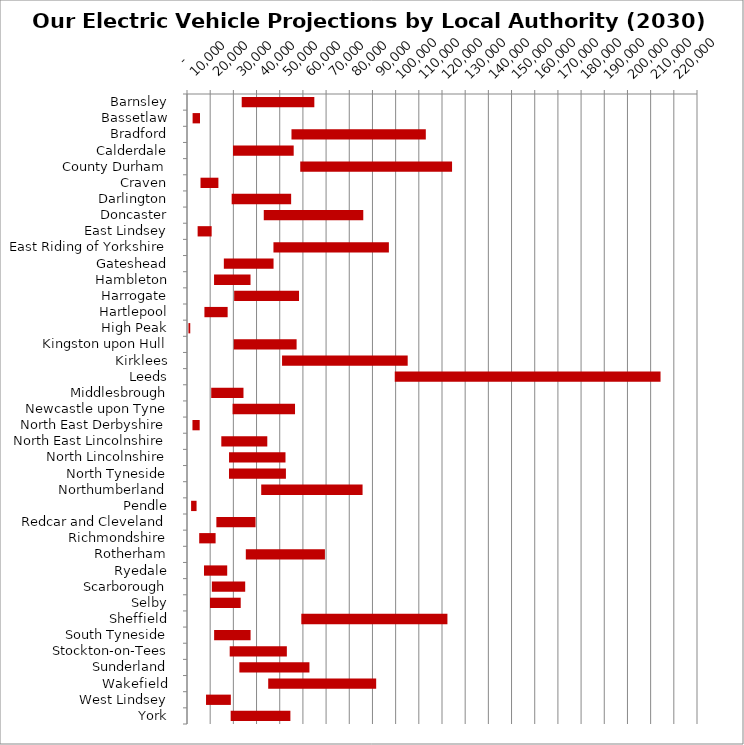
| Category | MIN | MAX |
|---|---|---|
| Barnsley | 23601 | 31328 |
| Bassetlaw | 2416 | 3187 |
| Bradford | 45069 | 57947 |
| Calderdale | 19852 | 26172 |
| County Durham | 48853 | 65486 |
| Craven | 5831 | 7712 |
| Darlington | 19267 | 25658 |
| Doncaster | 33117 | 42925 |
| East Lindsey | 4584 | 6050 |
| East Riding of Yorkshire | 37291 | 49794 |
| Gateshead | 15894 | 21439 |
| Hambleton | 11671 | 15729 |
| Harrogate | 20339 | 27982 |
| Hartlepool | 7515 | 10016 |
| High Peak | 624 | 779 |
| Kingston upon Hull | 20161 | 27120 |
| Kirklees | 41003 | 54198 |
| Leeds | 89622 | 114645 |
| Middlesbrough | 10445 | 13919 |
| Newcastle upon Tyne | 19670 | 26930 |
| North East Derbyshire | 2353 | 3116 |
| North East Lincolnshire | 14801 | 19834 |
| North Lincolnshire | 18135 | 24351 |
| North Tyneside | 18117 | 24555 |
| Northumberland | 32016 | 43718 |
| Pendle | 1768 | 2355 |
| Redcar and Cleveland | 12671 | 16897 |
| Richmondshire | 5266 | 7071 |
| Rotherham | 25372 | 34125 |
| Ryedale | 7345 | 9998 |
| Scarborough | 10725 | 14379 |
| Selby | 9910 | 13260 |
| Sheffield | 49314 | 63024 |
| South Tyneside | 11703 | 15721 |
| Stockton-on-Tees | 18419 | 24655 |
| Sunderland | 22591 | 30224 |
| Wakefield | 35030 | 46576 |
| West Lindsey | 8209 | 10701 |
| York | 18839 | 25759 |